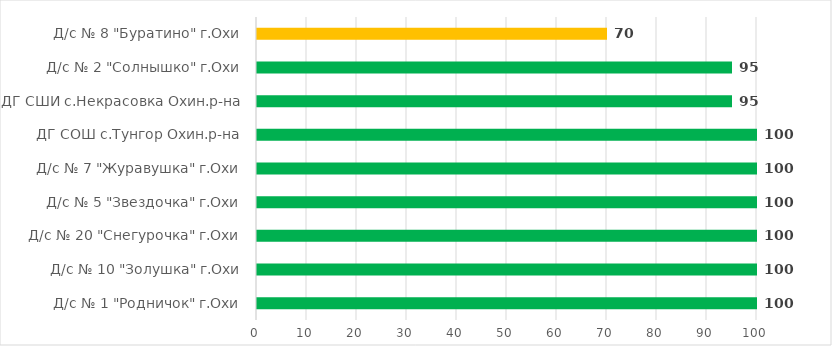
| Category | Series 0 |
|---|---|
| Д/с № 1 "Родничок" г.Охи | 100 |
| Д/с № 10 "Золушка" г.Охи | 100 |
| Д/с № 20 "Снегурочка" г.Охи | 100 |
| Д/с № 5 "Звездочка" г.Охи | 100 |
| Д/с № 7 "Журавушка" г.Охи | 100 |
| ДГ СОШ с.Тунгор Охин.р-на | 100 |
| ДГ СШИ с.Некрасовка Охин.р-на | 95 |
| Д/с № 2 "Солнышко" г.Охи | 95 |
| Д/с № 8 "Буратино" г.Охи | 70 |